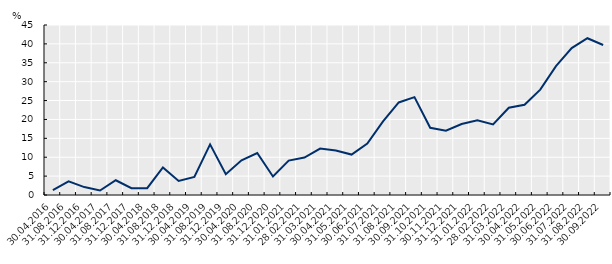
| Category | % |
|---|---|
| 30.04.2016 | 1.3 |
| 31.08.2016 | 3.6 |
| 31.12.2016 | 2.1 |
| 30.04.2017 | 1.2 |
| 31.08.2017 | 3.9 |
| 31.12.2017 | 1.8 |
| 30.04.2018 | 1.8 |
| 31.08.2018 | 7.3 |
| 31.12.2018 | 3.7 |
| 30.04.2019 | 4.8 |
| 31.08.2019 | 13.4 |
| 31.12.2019 | 5.5 |
| 30.04.2020 | 9.2 |
| 31.08.2020 | 11.1 |
| 31.12.2020 | 4.9 |
| 31.01.2021 | 9.1 |
| 28.02.2021 | 9.9 |
| 31.03.2021 | 12.3 |
| 30.04.2021 | 11.8 |
| 31.05.2021 | 10.7 |
| 30.06.2021 | 13.6 |
| 31.07.2021 | 19.5 |
| 31.08.2021 | 24.5 |
| 30.09.2021 | 25.9 |
| 31.10.2021 | 17.8 |
| 30.11.2021 | 17 |
| 31.12.2021 | 18.8 |
| 31.01.2022 | 19.8 |
| 28.02.2022 | 18.7 |
| 31.03.2022 | 23.1 |
| 30.04.2022 | 23.9 |
| 31.05.2022 | 27.9 |
| 30.06.2022 | 34.1 |
| 31.07.2022 | 38.9 |
| 31.08.2022 | 41.5 |
| 30.09.2022 | 39.7 |